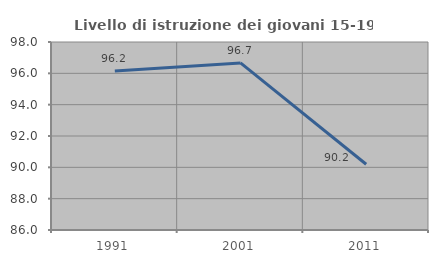
| Category | Livello di istruzione dei giovani 15-19 anni |
|---|---|
| 1991.0 | 96.154 |
| 2001.0 | 96.667 |
| 2011.0 | 90.196 |